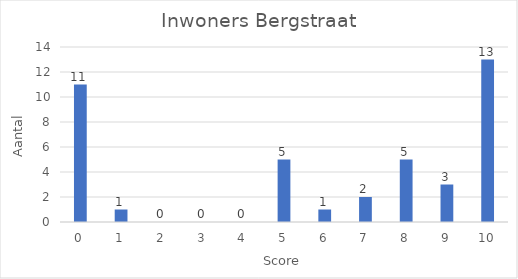
| Category | Aantal |
|---|---|
| 0.0 | 11 |
| 1.0 | 1 |
| 2.0 | 0 |
| 3.0 | 0 |
| 4.0 | 0 |
| 5.0 | 5 |
| 6.0 | 1 |
| 7.0 | 2 |
| 8.0 | 5 |
| 9.0 | 3 |
| 10.0 | 13 |